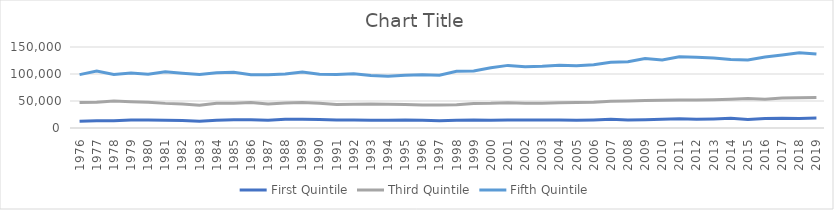
| Category | First Quintile | Third Quintile | Fifth Quintile |
|---|---|---|---|
| 1976.0 | 12300 | 47400 | 98800 |
| 1977.0 | 13350 | 47650 | 105600 |
| 1978.0 | 13650 | 49850 | 98950 |
| 1979.0 | 14950 | 48700 | 102050 |
| 1980.0 | 14600 | 47700 | 99500 |
| 1981.0 | 14500 | 45600 | 104200 |
| 1982.0 | 14050 | 44400 | 101350 |
| 1983.0 | 12500 | 42000 | 99200 |
| 1984.0 | 14200 | 45800 | 102450 |
| 1985.0 | 15050 | 45900 | 103150 |
| 1986.0 | 15200 | 47100 | 98800 |
| 1987.0 | 14550 | 44300 | 98800 |
| 1988.0 | 16100 | 46250 | 100050 |
| 1989.0 | 16200 | 47250 | 103800 |
| 1990.0 | 15750 | 45900 | 99700 |
| 1991.0 | 14950 | 43700 | 99000 |
| 1992.0 | 14700 | 43800 | 100550 |
| 1993.0 | 14350 | 44400 | 97100 |
| 1994.0 | 14400 | 44000 | 96000 |
| 1995.0 | 15000 | 43350 | 97650 |
| 1996.0 | 14450 | 42800 | 98750 |
| 1997.0 | 13450 | 42750 | 97600 |
| 1998.0 | 14400 | 43250 | 104900 |
| 1999.0 | 14900 | 45400 | 105700 |
| 2000.0 | 14500 | 45650 | 111650 |
| 2001.0 | 14800 | 46900 | 115950 |
| 2002.0 | 14700 | 45900 | 113250 |
| 2003.0 | 14600 | 46000 | 114250 |
| 2004.0 | 14950 | 46600 | 116300 |
| 2005.0 | 14250 | 47150 | 115100 |
| 2006.0 | 15000 | 47700 | 117200 |
| 2007.0 | 16400 | 49550 | 121550 |
| 2008.0 | 14900 | 49950 | 122600 |
| 2009.0 | 15350 | 50700 | 128550 |
| 2010.0 | 16250 | 51250 | 125900 |
| 2011.0 | 16900 | 51700 | 131900 |
| 2012.0 | 16050 | 51800 | 131150 |
| 2013.0 | 16750 | 52200 | 129750 |
| 2014.0 | 17900 | 53250 | 126800 |
| 2015.0 | 15650 | 54400 | 126000 |
| 2016.0 | 17450 | 53300 | 131400 |
| 2017.0 | 18000 | 55600 | 135100 |
| 2018.0 | 17750 | 55850 | 139300 |
| 2019.0 | 18350 | 56350 | 136900 |